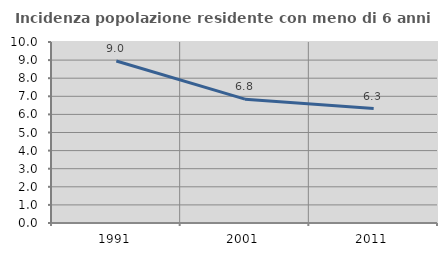
| Category | Incidenza popolazione residente con meno di 6 anni |
|---|---|
| 1991.0 | 8.951 |
| 2001.0 | 6.841 |
| 2011.0 | 6.321 |